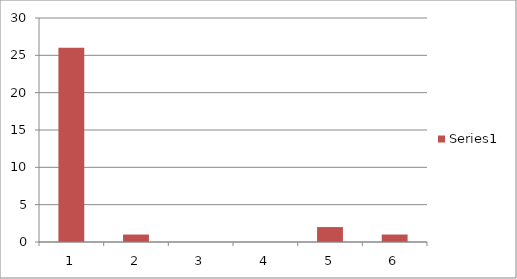
| Category | Series 1 |
|---|---|
| 0 | 26 |
| 1 | 1 |
| 2 | 0 |
| 3 | 0 |
| 4 | 2 |
| 5 | 1 |